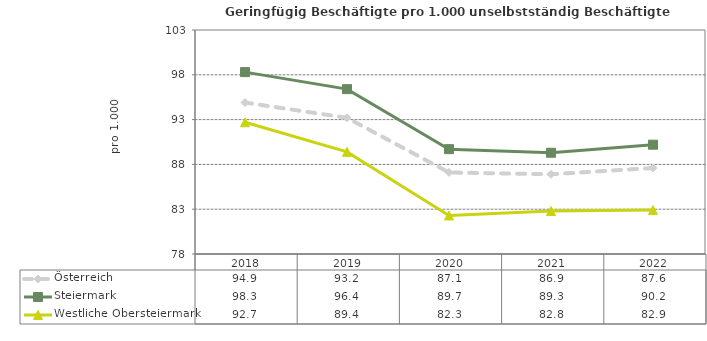
| Category | Österreich | Steiermark | Westliche Obersteiermark |
|---|---|---|---|
| 2022.0 | 87.6 | 90.2 | 82.9 |
| 2021.0 | 86.9 | 89.3 | 82.8 |
| 2020.0 | 87.1 | 89.7 | 82.3 |
| 2019.0 | 93.2 | 96.4 | 89.4 |
| 2018.0 | 94.9 | 98.3 | 92.7 |